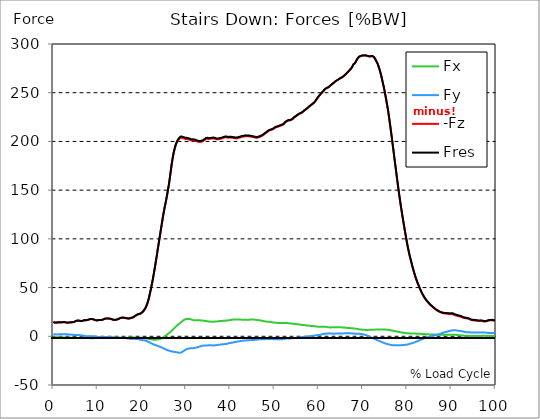
| Category |  Fx |  Fy |  -Fz |  Fres |
|---|---|---|---|---|
| 0.0 | -0.856 | 2.139 | 14.563 | 14.754 |
| 0.167348456675344 | -0.887 | 2.158 | 14.25 | 14.45 |
| 0.334696913350688 | -0.89 | 2.078 | 13.935 | 14.126 |
| 0.5020453700260321 | -0.883 | 1.944 | 13.782 | 13.958 |
| 0.669393826701376 | -0.934 | 1.92 | 13.981 | 14.156 |
| 0.83674228337672 | -0.978 | 1.918 | 14.109 | 14.286 |
| 1.0040907400520642 | -1.011 | 1.95 | 14.139 | 14.321 |
| 1.1621420602454444 | -1.048 | 1.988 | 14.155 | 14.344 |
| 1.3294905169207885 | -1.08 | 2.017 | 14.145 | 14.338 |
| 1.4968389735961325 | -1.109 | 2.034 | 14.122 | 14.32 |
| 1.6641874302714765 | -1.133 | 2.03 | 14.132 | 14.327 |
| 1.8315358869468206 | -1.163 | 2.047 | 14.205 | 14.402 |
| 1.9988843436221646 | -1.197 | 2.075 | 14.298 | 14.501 |
| 2.1662328002975086 | -1.246 | 2.134 | 14.36 | 14.575 |
| 2.333581256972853 | -1.307 | 2.191 | 14.387 | 14.616 |
| 2.5009297136481967 | -1.357 | 2.228 | 14.334 | 14.575 |
| 2.6682781703235405 | -1.373 | 2.208 | 14.266 | 14.507 |
| 2.8356266269988843 | -1.379 | 2.179 | 14.081 | 14.322 |
| 3.002975083674229 | -1.381 | 2.147 | 13.872 | 14.113 |
| 3.1703235403495724 | -1.372 | 2.031 | 13.808 | 14.033 |
| 3.337671997024917 | -1.369 | 1.926 | 13.778 | 13.99 |
| 3.4957233172182973 | -1.386 | 1.842 | 13.952 | 14.154 |
| 3.663071773893641 | -1.407 | 1.803 | 14.104 | 14.302 |
| 3.8304202305689854 | -1.422 | 1.763 | 14.195 | 14.389 |
| 3.997768687244329 | -1.436 | 1.713 | 14.263 | 14.449 |
| 4.165117143919673 | -1.45 | 1.664 | 14.335 | 14.513 |
| 4.332465600595017 | -1.462 | 1.601 | 14.401 | 14.57 |
| 4.499814057270361 | -1.467 | 1.502 | 14.439 | 14.595 |
| 4.667162513945706 | -1.47 | 1.398 | 14.538 | 14.682 |
| 4.834510970621049 | -1.493 | 1.328 | 15.018 | 15.155 |
| 5.001859427296393 | -1.551 | 1.334 | 15.474 | 15.612 |
| 5.169207883971737 | -1.612 | 1.361 | 15.71 | 15.856 |
| 5.336556340647081 | -1.659 | 1.344 | 15.936 | 16.082 |
| 5.503904797322425 | -1.707 | 1.318 | 16.056 | 16.205 |
| 5.671253253997769 | -1.746 | 1.278 | 16.058 | 16.207 |
| 5.82930457419115 | -1.773 | 1.224 | 15.947 | 16.096 |
| 5.996653030866494 | -1.79 | 1.154 | 15.799 | 15.946 |
| 6.164001487541838 | -1.785 | 1.029 | 15.674 | 15.814 |
| 6.331349944217181 | -1.767 | 0.879 | 15.52 | 15.65 |
| 6.498698400892526 | -1.763 | 0.75 | 15.679 | 15.801 |
| 6.66604685756787 | -1.762 | 0.626 | 15.905 | 16.021 |
| 6.833395314243213 | -1.779 | 0.536 | 16.179 | 16.292 |
| 7.000743770918558 | -1.831 | 0.504 | 16.479 | 16.594 |
| 7.168092227593902 | -1.816 | 0.355 | 16.421 | 16.531 |
| 7.335440684269246 | -1.771 | 0.145 | 16.364 | 16.465 |
| 7.50278914094459 | -1.733 | -0.04 | 16.389 | 16.483 |
| 7.6701375976199335 | -1.726 | -0.129 | 16.654 | 16.747 |
| 7.837486054295278 | -1.774 | -0.1 | 16.971 | 17.067 |
| 7.995537374488658 | -1.821 | -0.076 | 17.109 | 17.209 |
| 8.162885831164003 | -1.878 | -0.048 | 17.316 | 17.421 |
| 8.330234287839346 | -1.936 | -0.023 | 17.607 | 17.716 |
| 8.49758274451469 | -1.982 | -0.014 | 17.65 | 17.763 |
| 8.664931201190035 | -2.027 | 0.01 | 17.646 | 17.764 |
| 8.832279657865378 | -2.037 | -0.003 | 17.536 | 17.656 |
| 8.999628114540721 | -2.023 | -0.032 | 17.356 | 17.477 |
| 9.166976571216066 | -1.99 | -0.073 | 17.115 | 17.234 |
| 9.334325027891412 | -1.906 | -0.164 | 16.813 | 16.926 |
| 9.501673484566755 | -1.789 | -0.298 | 16.509 | 16.614 |
| 9.669021941242098 | -1.671 | -0.451 | 16.307 | 16.406 |
| 9.836370397917442 | -1.551 | -0.586 | 16.242 | 16.335 |
| 10.003718854592787 | -1.452 | -0.69 | 16.324 | 16.411 |
| 10.17106731126813 | -1.381 | -0.77 | 16.445 | 16.528 |
| 10.329118631461512 | -1.363 | -0.788 | 16.699 | 16.779 |
| 10.496467088136853 | -1.409 | -0.711 | 16.793 | 16.875 |
| 10.663815544812199 | -1.403 | -0.745 | 16.701 | 16.784 |
| 10.831164001487544 | -1.362 | -0.861 | 16.615 | 16.701 |
| 10.998512458162887 | -1.343 | -0.929 | 16.738 | 16.827 |
| 11.16586091483823 | -1.35 | -0.95 | 17.023 | 17.112 |
| 11.333209371513574 | -1.393 | -0.921 | 17.376 | 17.464 |
| 11.50055782818892 | -1.439 | -0.891 | 17.702 | 17.79 |
| 11.667906284864264 | -1.516 | -0.824 | 17.996 | 18.086 |
| 11.835254741539607 | -1.592 | -0.763 | 18.184 | 18.276 |
| 12.00260319821495 | -1.657 | -0.718 | 18.248 | 18.343 |
| 12.169951654890292 | -1.718 | -0.681 | 18.296 | 18.395 |
| 12.337300111565641 | -1.756 | -0.67 | 18.253 | 18.355 |
| 12.504648568240984 | -1.778 | -0.676 | 18.165 | 18.271 |
| 12.662699888434362 | -1.796 | -0.677 | 18.087 | 18.194 |
| 12.830048345109708 | -1.812 | -0.679 | 18.006 | 18.114 |
| 12.997396801785053 | -1.779 | -0.733 | 17.819 | 17.927 |
| 13.164745258460396 | -1.731 | -0.815 | 17.521 | 17.631 |
| 13.33209371513574 | -1.664 | -0.936 | 17.182 | 17.295 |
| 13.499442171811083 | -1.575 | -1.082 | 16.939 | 17.056 |
| 13.666790628486426 | -1.48 | -1.21 | 16.779 | 16.899 |
| 13.834139085161771 | -1.405 | -1.323 | 16.706 | 16.828 |
| 14.001487541837117 | -1.364 | -1.421 | 16.775 | 16.9 |
| 14.16883599851246 | -1.34 | -1.507 | 16.89 | 17.019 |
| 14.336184455187803 | -1.347 | -1.56 | 17.072 | 17.204 |
| 14.503532911863147 | -1.377 | -1.592 | 17.316 | 17.45 |
| 14.670881368538492 | -1.428 | -1.594 | 17.622 | 17.758 |
| 14.828932688731873 | -1.493 | -1.571 | 17.994 | 18.13 |
| 14.996281145407215 | -1.588 | -1.537 | 18.358 | 18.495 |
| 15.163629602082558 | -1.693 | -1.508 | 18.718 | 18.858 |
| 15.330978058757903 | -1.77 | -1.493 | 18.964 | 19.108 |
| 15.498326515433247 | -1.836 | -1.498 | 19.048 | 19.197 |
| 15.665674972108594 | -1.855 | -1.515 | 19.025 | 19.179 |
| 15.833023428783937 | -1.854 | -1.548 | 19.024 | 19.18 |
| 16.00037188545928 | -1.844 | -1.595 | 18.956 | 19.115 |
| 16.167720342134626 | -1.805 | -1.679 | 18.82 | 18.984 |
| 16.335068798809967 | -1.746 | -1.786 | 18.662 | 18.834 |
| 16.502417255485312 | -1.66 | -1.921 | 18.483 | 18.663 |
| 16.669765712160658 | -1.557 | -2.07 | 18.311 | 18.501 |
| 16.837114168836 | -1.443 | -2.22 | 18.169 | 18.37 |
| 17.004462625511344 | -1.323 | -2.365 | 18.104 | 18.317 |
| 17.16251394570472 | -1.224 | -2.495 | 18.181 | 18.404 |
| 17.32986240238007 | -1.149 | -2.6 | 18.353 | 18.583 |
| 17.497210859055414 | -1.111 | -2.662 | 18.597 | 18.832 |
| 17.664559315730756 | -1.079 | -2.719 | 18.814 | 19.05 |
| 17.8319077724061 | -1.133 | -2.689 | 19.011 | 19.247 |
| 17.999256229081443 | -1.18 | -2.67 | 19.31 | 19.542 |
| 18.166604685756788 | -1.242 | -2.645 | 19.761 | 19.989 |
| 18.333953142432133 | -1.334 | -2.627 | 20.32 | 20.544 |
| 18.501301599107478 | -1.439 | -2.632 | 20.833 | 21.059 |
| 18.668650055782823 | -1.544 | -2.671 | 21.257 | 21.491 |
| 18.835998512458165 | -1.636 | -2.745 | 21.714 | 21.958 |
| 19.00334696913351 | -1.721 | -2.859 | 22.211 | 22.469 |
| 19.170695425808855 | -1.747 | -2.975 | 22.441 | 22.712 |
| 19.338043882484197 | -1.714 | -3.152 | 22.61 | 22.899 |
| 19.496095202677576 | -1.657 | -3.359 | 22.805 | 23.116 |
| 19.66344365935292 | -1.586 | -3.558 | 23.028 | 23.362 |
| 19.830792116028263 | -1.545 | -3.734 | 23.37 | 23.725 |
| 19.998140572703612 | -1.617 | -3.86 | 24.08 | 24.449 |
| 20.165489029378953 | -1.664 | -3.957 | 24.751 | 25.128 |
| 20.3328374860543 | -1.75 | -4.006 | 25.448 | 25.827 |
| 20.500185942729644 | -1.856 | -4.114 | 26.407 | 26.796 |
| 20.667534399404985 | -1.987 | -4.297 | 27.7 | 28.107 |
| 20.83488285608033 | -2.124 | -4.437 | 28.876 | 29.297 |
| 21.002231312755672 | -2.273 | -4.689 | 30.488 | 30.936 |
| 21.16957976943102 | -2.427 | -5.004 | 32.407 | 32.888 |
| 21.336928226106362 | -2.592 | -5.348 | 34.663 | 35.175 |
| 21.504276682781704 | -2.758 | -5.705 | 37.169 | 37.711 |
| 21.67162513945705 | -2.905 | -6.083 | 40.21 | 40.778 |
| 21.82967645965043 | -3.047 | -6.468 | 43.575 | 44.164 |
| 21.997024916325774 | -3.174 | -6.849 | 47.05 | 47.658 |
| 22.16437337300112 | -3.279 | -7.244 | 50.66 | 51.286 |
| 22.33172182967646 | -3.361 | -7.64 | 54.411 | 55.055 |
| 22.499070286351806 | -3.428 | -7.991 | 58.438 | 59.09 |
| 22.666418743027148 | -3.484 | -8.305 | 62.654 | 63.307 |
| 22.833767199702496 | -3.522 | -8.602 | 67.057 | 67.707 |
| 23.00111565637784 | -3.505 | -8.892 | 71.548 | 72.192 |
| 23.168464113053183 | -3.424 | -9.173 | 76.198 | 76.835 |
| 23.335812569728528 | -3.379 | -9.451 | 80.88 | 81.51 |
| 23.50316102640387 | -3.314 | -9.754 | 85.886 | 86.512 |
| 23.670509483079215 | -3.21 | -10.031 | 90.663 | 91.282 |
| 23.83785793975456 | -3.077 | -10.291 | 95.404 | 96.017 |
| 23.995909259947936 | -2.908 | -10.551 | 100.14 | 100.744 |
| 24.163257716623285 | -2.673 | -10.854 | 104.946 | 105.549 |
| 24.330606173298627 | -2.416 | -11.176 | 109.795 | 110.398 |
| 24.49795462997397 | -2.083 | -11.527 | 114.503 | 115.109 |
| 24.665303086649313 | -1.681 | -11.904 | 119.182 | 119.796 |
| 24.83265154332466 | -1.255 | -12.285 | 123.802 | 124.424 |
| 25.0 | -0.751 | -12.625 | 127.965 | 128.598 |
| 25.167348456675345 | -0.207 | -12.983 | 132.083 | 132.731 |
| 25.334696913350694 | 0.381 | -13.331 | 135.666 | 136.33 |
| 25.502045370026035 | 0.99 | -13.67 | 139.379 | 140.058 |
| 25.669393826701377 | 1.621 | -13.983 | 143.398 | 144.093 |
| 25.836742283376722 | 2.25 | -14.277 | 147.712 | 148.424 |
| 26.004090740052067 | 2.853 | -14.524 | 152.145 | 152.87 |
| 26.17143919672741 | 3.444 | -14.744 | 156.581 | 157.318 |
| 26.329490516920792 | 3.987 | -15.001 | 161.968 | 162.718 |
| 26.49683897359613 | 4.579 | -15.243 | 167.689 | 168.448 |
| 26.66418743027148 | 5.221 | -15.383 | 173.395 | 174.162 |
| 26.831535886946828 | 5.939 | -15.538 | 178.668 | 179.45 |
| 26.998884343622166 | 6.743 | -15.746 | 182.991 | 183.798 |
| 27.166232800297514 | 7.512 | -15.892 | 187.215 | 188.047 |
| 27.333581256972852 | 8.291 | -16.006 | 190.386 | 191.247 |
| 27.5009297136482 | 9.054 | -16.118 | 193.368 | 194.259 |
| 27.668278170323543 | 9.795 | -16.237 | 195.916 | 196.839 |
| 27.835626626998888 | 10.506 | -16.378 | 197.877 | 198.84 |
| 28.002975083674233 | 11.219 | -16.505 | 199.533 | 200.537 |
| 28.170323540349575 | 11.922 | -16.644 | 200.79 | 201.839 |
| 28.33767199702492 | 12.488 | -16.79 | 201.789 | 202.879 |
| 28.50502045370026 | 13.004 | -16.908 | 202.865 | 203.991 |
| 28.663071773893645 | 13.577 | -16.928 | 203.644 | 204.804 |
| 28.830420230568986 | 14.216 | -16.75 | 203.923 | 205.11 |
| 28.99776868724433 | 14.848 | -16.393 | 203.981 | 205.186 |
| 29.165117143919673 | 15.527 | -15.91 | 203.656 | 204.875 |
| 29.33246560059502 | 16.126 | -15.429 | 203.368 | 204.599 |
| 29.499814057270367 | 16.677 | -14.913 | 203.107 | 204.346 |
| 29.66716251394571 | 17.116 | -14.407 | 202.86 | 204.1 |
| 29.834510970621054 | 17.474 | -13.964 | 202.493 | 203.736 |
| 30.00185942729639 | 17.686 | -13.559 | 202.481 | 203.716 |
| 30.169207883971744 | 17.824 | -13.165 | 202.46 | 203.682 |
| 30.33655634064708 | 17.879 | -12.893 | 202.447 | 203.656 |
| 30.50390479732243 | 17.868 | -12.679 | 202.149 | 203.346 |
| 30.671253253997772 | 17.786 | -12.481 | 202.007 | 203.185 |
| 30.829304574191156 | 17.686 | -12.315 | 201.664 | 202.826 |
| 30.996653030866494 | 17.53 | -12.262 | 201.292 | 202.437 |
| 31.164001487541842 | 17.307 | -12.262 | 201.091 | 202.218 |
| 31.331349944217187 | 17.018 | -12.226 | 201.05 | 202.15 |
| 31.498698400892525 | 16.712 | -12.215 | 201.112 | 202.186 |
| 31.666046857567874 | 16.503 | -12.147 | 201.141 | 202.193 |
| 31.833395314243212 | 16.41 | -12.021 | 200.972 | 202.011 |
| 32.00074377091856 | 16.364 | -11.862 | 200.979 | 202.007 |
| 32.1680922275939 | 16.334 | -11.71 | 200.688 | 201.707 |
| 32.33544068426925 | 16.418 | -11.552 | 200.29 | 201.307 |
| 32.50278914094459 | 16.458 | -11.376 | 199.936 | 200.949 |
| 32.670137597619934 | 16.465 | -11.178 | 199.666 | 200.67 |
| 32.83748605429528 | 16.436 | -10.945 | 199.563 | 200.553 |
| 33.004834510970625 | 16.406 | -10.713 | 199.459 | 200.436 |
| 33.162885831164004 | 16.352 | -10.444 | 199.464 | 200.427 |
| 33.33023428783935 | 16.297 | -10.164 | 199.591 | 200.536 |
| 33.497582744514695 | 16.238 | -9.91 | 199.767 | 200.699 |
| 33.664931201190036 | 16.178 | -9.68 | 199.987 | 200.906 |
| 33.83227965786538 | 16.096 | -9.591 | 200.417 | 201.325 |
| 33.99962811454073 | 15.975 | -9.563 | 200.864 | 201.761 |
| 34.16697657121607 | 15.873 | -9.534 | 201.479 | 202.365 |
| 34.33432502789141 | 15.772 | -9.505 | 202.096 | 202.971 |
| 34.50167348456676 | 15.663 | -9.494 | 202.675 | 203.538 |
| 34.6690219412421 | 15.497 | -9.444 | 202.986 | 203.834 |
| 34.83637039791744 | 15.354 | -9.424 | 202.877 | 203.713 |
| 35.00371885459279 | 15.293 | -9.32 | 202.584 | 203.413 |
| 35.17106731126814 | 15.231 | -9.256 | 202.514 | 203.335 |
| 35.338415767943474 | 15.175 | -9.22 | 202.54 | 203.355 |
| 35.49646708813686 | 15.107 | -9.243 | 202.75 | 203.56 |
| 35.6638155448122 | 15.04 | -9.283 | 202.883 | 203.689 |
| 35.831164001487544 | 14.98 | -9.318 | 202.964 | 203.766 |
| 35.998512458162885 | 14.95 | -9.337 | 203.093 | 203.893 |
| 36.165860914838234 | 14.977 | -9.355 | 203.178 | 203.98 |
| 36.333209371513576 | 15.013 | -9.36 | 203.144 | 203.95 |
| 36.50055782818892 | 15.072 | -9.346 | 202.896 | 203.707 |
| 36.667906284864266 | 15.138 | -9.29 | 202.536 | 203.35 |
| 36.83525474153961 | 15.204 | -9.121 | 202.282 | 203.093 |
| 37.002603198214956 | 15.279 | -8.961 | 202.172 | 202.978 |
| 37.1699516548903 | 15.372 | -8.863 | 202.197 | 203.003 |
| 37.337300111565646 | 15.452 | -8.74 | 202.403 | 203.206 |
| 37.50464856824098 | 15.521 | -8.654 | 202.495 | 203.297 |
| 37.66269988843437 | 15.586 | -8.559 | 202.642 | 203.442 |
| 37.83004834510971 | 15.651 | -8.459 | 202.812 | 203.61 |
| 37.99739680178505 | 15.719 | -8.358 | 203.004 | 203.8 |
| 38.16474525846039 | 15.787 | -8.256 | 203.21 | 204.005 |
| 38.33209371513574 | 15.844 | -8.162 | 203.477 | 204.269 |
| 38.49944217181109 | 15.887 | -8.085 | 203.827 | 204.618 |
| 38.666790628486424 | 15.964 | -8.048 | 204.059 | 204.853 |
| 38.83413908516178 | 16.055 | -8.018 | 204.242 | 205.042 |
| 39.001487541837115 | 16.13 | -7.956 | 204.433 | 205.236 |
| 39.16883599851246 | 16.221 | -7.834 | 204.289 | 205.095 |
| 39.336184455187805 | 16.293 | -7.678 | 203.914 | 204.721 |
| 39.503532911863154 | 16.379 | -7.385 | 203.754 | 204.56 |
| 39.670881368538495 | 16.428 | -7.075 | 203.972 | 204.772 |
| 39.83822982521384 | 16.501 | -6.893 | 204.011 | 204.813 |
| 39.996281145407224 | 16.627 | -6.814 | 203.959 | 204.77 |
| 40.163629602082565 | 16.793 | -6.75 | 203.908 | 204.733 |
| 40.33097805875791 | 16.978 | -6.67 | 203.868 | 204.707 |
| 40.498326515433256 | 17.079 | -6.464 | 203.783 | 204.625 |
| 40.6656749721086 | 17.154 | -6.309 | 203.693 | 204.537 |
| 40.83302342878393 | 17.22 | -6.169 | 203.457 | 204.304 |
| 41.00037188545929 | 17.233 | -6.002 | 203.306 | 204.149 |
| 41.16772034213463 | 17.258 | -5.827 | 203.219 | 204.06 |
| 41.33506879880997 | 17.285 | -5.65 | 203.14 | 203.979 |
| 41.50241725548531 | 17.298 | -5.495 | 203.103 | 203.94 |
| 41.66976571216066 | 17.301 | -5.375 | 203.271 | 204.105 |
| 41.837114168836 | 17.32 | -5.325 | 203.697 | 204.528 |
| 42.004462625511344 | 17.294 | -5.186 | 203.907 | 204.731 |
| 42.17181108218669 | 17.218 | -5.036 | 203.983 | 204.795 |
| 42.32986240238007 | 17.17 | -4.923 | 204.318 | 205.12 |
| 42.497210859055414 | 17.114 | -4.805 | 204.608 | 205.4 |
| 42.66455931573076 | 17.013 | -4.651 | 204.68 | 205.46 |
| 42.831907772406105 | 16.937 | -4.521 | 204.807 | 205.577 |
| 42.999256229081446 | 16.904 | -4.431 | 205.005 | 205.769 |
| 43.16660468575679 | 16.874 | -4.368 | 205.18 | 205.94 |
| 43.33395314243214 | 16.843 | -4.31 | 205.366 | 206.122 |
| 43.50130159910748 | 16.857 | -4.283 | 205.473 | 206.23 |
| 43.66865005578282 | 16.89 | -4.205 | 205.395 | 206.154 |
| 43.83599851245817 | 16.913 | -4.171 | 205.302 | 206.063 |
| 44.00334696913351 | 16.947 | -4.131 | 205.34 | 206.104 |
| 44.17069542580886 | 16.964 | -4.042 | 205.401 | 206.164 |
| 44.3380438824842 | 17.012 | -3.957 | 205.354 | 206.121 |
| 44.49609520267758 | 17.118 | -3.935 | 205.083 | 205.86 |
| 44.66344365935292 | 17.173 | -3.892 | 204.785 | 205.566 |
| 44.83079211602827 | 17.174 | -3.803 | 204.824 | 205.607 |
| 44.99814057270361 | 17.201 | -3.81 | 204.721 | 205.508 |
| 45.16548902937895 | 17.21 | -3.815 | 204.472 | 205.262 |
| 45.332837486054295 | 17.171 | -3.808 | 204.287 | 205.075 |
| 45.500185942729644 | 17.082 | -3.711 | 204.133 | 204.911 |
| 45.66753439940499 | 16.992 | -3.625 | 203.968 | 204.738 |
| 45.83488285608033 | 16.9 | -3.55 | 203.8 | 204.562 |
| 46.00223131275568 | 16.791 | -3.436 | 203.784 | 204.536 |
| 46.16957976943102 | 16.68 | -3.309 | 203.868 | 204.608 |
| 46.336928226106366 | 16.575 | -3.177 | 204.146 | 204.877 |
| 46.50427668278171 | 16.469 | -3.121 | 204.411 | 205.134 |
| 46.671625139457056 | 16.366 | -3.096 | 204.664 | 205.38 |
| 46.829676459650436 | 16.242 | -3.071 | 204.907 | 205.613 |
| 46.99702491632577 | 16.112 | -3.048 | 205.28 | 205.975 |
| 47.16437337300112 | 15.969 | -3.02 | 205.751 | 206.434 |
| 47.33172182967646 | 15.813 | -2.989 | 206.228 | 206.897 |
| 47.49907028635181 | 15.636 | -2.989 | 206.741 | 207.397 |
| 47.66641874302716 | 15.452 | -2.967 | 207.388 | 208.03 |
| 47.83376719970249 | 15.305 | -2.931 | 207.95 | 208.58 |
| 48.001115656377834 | 15.2 | -2.895 | 208.495 | 209.116 |
| 48.16846411305319 | 15.115 | -2.879 | 209.044 | 209.656 |
| 48.33581256972853 | 15.027 | -2.86 | 209.624 | 210.227 |
| 48.50316102640387 | 14.963 | -2.845 | 210.243 | 210.837 |
| 48.67050948307921 | 14.909 | -2.821 | 210.793 | 211.38 |
| 48.837857939754564 | 14.862 | -2.786 | 211.294 | 211.874 |
| 49.005206396429905 | 14.762 | -2.766 | 211.673 | 212.243 |
| 49.163257716623285 | 14.642 | -2.798 | 211.743 | 212.306 |
| 49.33060617329863 | 14.486 | -2.852 | 211.929 | 212.482 |
| 49.49795462997397 | 14.336 | -2.907 | 212.187 | 212.731 |
| 49.66530308664932 | 14.193 | -2.961 | 212.543 | 213.079 |
| 49.832651543324666 | 14.096 | -2.975 | 213.053 | 213.582 |
| 50.0 | 14.019 | -2.963 | 213.666 | 214.189 |
| 50.16734845667534 | 13.943 | -2.95 | 214.271 | 214.787 |
| 50.33469691335069 | 13.879 | -2.981 | 214.529 | 215.042 |
| 50.50204537002604 | 13.816 | -3.014 | 214.788 | 215.298 |
| 50.66939382670139 | 13.77 | -3.026 | 215.016 | 215.523 |
| 50.836742283376715 | 13.732 | -3.02 | 215.257 | 215.763 |
| 51.00409074005207 | 13.689 | -3.011 | 215.534 | 216.035 |
| 51.17143919672741 | 13.675 | -3 | 215.809 | 216.309 |
| 51.32949051692079 | 13.684 | -3.004 | 216.115 | 216.615 |
| 51.496838973596134 | 13.706 | -3.018 | 216.431 | 216.931 |
| 51.66418743027148 | 13.754 | -3.033 | 216.648 | 217.151 |
| 51.831535886946824 | 13.779 | -2.984 | 217.017 | 217.52 |
| 51.99888434362217 | 13.75 | -2.805 | 217.579 | 218.079 |
| 52.16623280029752 | 13.69 | -2.648 | 218.125 | 218.619 |
| 52.33358125697285 | 13.626 | -2.46 | 219.054 | 219.542 |
| 52.5009297136482 | 13.577 | -2.325 | 219.85 | 220.335 |
| 52.668278170323546 | 13.571 | -2.317 | 220.276 | 220.76 |
| 52.835626626998895 | 13.57 | -2.317 | 220.708 | 221.193 |
| 53.00297508367424 | 13.521 | -2.314 | 221.147 | 221.628 |
| 53.17032354034958 | 13.465 | -2.314 | 221.501 | 221.979 |
| 53.33767199702492 | 13.379 | -2.311 | 221.468 | 221.941 |
| 53.50502045370027 | 13.286 | -2.252 | 221.543 | 222.009 |
| 53.663071773893655 | 13.169 | -2.16 | 221.812 | 222.27 |
| 53.83042023056899 | 13.028 | -2.105 | 222.157 | 222.607 |
| 53.99776868724433 | 12.926 | -2.024 | 222.679 | 223.122 |
| 54.16511714391967 | 12.829 | -1.932 | 223.185 | 223.623 |
| 54.33246560059503 | 12.769 | -1.934 | 224.132 | 224.568 |
| 54.49981405727037 | 12.71 | -1.901 | 224.747 | 225.179 |
| 54.667162513945705 | 12.626 | -1.827 | 225.184 | 225.608 |
| 54.834510970621054 | 12.481 | -1.694 | 225.721 | 226.134 |
| 55.0018594272964 | 12.349 | -1.609 | 226.415 | 226.819 |
| 55.169207883971744 | 12.322 | -1.503 | 226.878 | 227.279 |
| 55.336556340647086 | 12.282 | -1.413 | 227.421 | 227.819 |
| 55.50390479732243 | 12.18 | -1.297 | 227.936 | 228.325 |
| 55.671253253997776 | 12.081 | -1.199 | 228.353 | 228.734 |
| 55.83860171067312 | 11.968 | -1.128 | 228.727 | 229.099 |
| 55.9966530308665 | 11.817 | -1.028 | 229.106 | 229.473 |
| 56.16400148754184 | 11.718 | -0.903 | 229.481 | 229.844 |
| 56.33134994421718 | 11.679 | -0.783 | 229.932 | 230.292 |
| 56.498698400892536 | 11.615 | -0.717 | 230.545 | 230.9 |
| 56.66604685756788 | 11.542 | -0.672 | 231.226 | 231.576 |
| 56.83339531424321 | 11.436 | -0.598 | 231.97 | 232.314 |
| 57.00074377091856 | 11.295 | -0.496 | 232.506 | 232.844 |
| 57.16809222759391 | 11.169 | -0.388 | 233.014 | 233.347 |
| 57.33544068426925 | 11.081 | -0.266 | 233.617 | 233.947 |
| 57.5027891409446 | 11.014 | -0.137 | 234.31 | 234.638 |
| 57.670137597619934 | 10.947 | -0.036 | 235.01 | 235.336 |
| 57.83748605429528 | 10.902 | 0.032 | 235.621 | 235.946 |
| 58.004834510970625 | 10.825 | 0.084 | 236.296 | 236.616 |
| 58.16288583116401 | 10.689 | 0.17 | 236.923 | 237.236 |
| 58.330234287839346 | 10.559 | 0.263 | 237.497 | 237.806 |
| 58.497582744514695 | 10.471 | 0.382 | 237.985 | 238.29 |
| 58.66493120119004 | 10.442 | 0.529 | 238.518 | 238.821 |
| 58.832279657865385 | 10.401 | 0.693 | 239.264 | 239.567 |
| 58.999628114540734 | 10.329 | 0.776 | 239.946 | 240.248 |
| 59.16697657121607 | 10.232 | 0.854 | 240.753 | 241.05 |
| 59.33432502789142 | 10.136 | 0.964 | 241.902 | 242.195 |
| 59.50167348456676 | 10.037 | 1.062 | 243.035 | 243.323 |
| 59.66902194124211 | 9.945 | 1.138 | 244.1 | 244.385 |
| 59.83637039791745 | 9.861 | 1.226 | 245.188 | 245.471 |
| 60.00371885459278 | 9.776 | 1.313 | 246.277 | 246.558 |
| 60.17106731126813 | 9.742 | 1.434 | 247.294 | 247.575 |
| 60.33841576794349 | 9.702 | 1.557 | 248.036 | 248.315 |
| 60.49646708813685 | 9.728 | 1.721 | 248.909 | 249.188 |
| 60.6638155448122 | 9.764 | 1.906 | 249.737 | 250.018 |
| 60.831164001487544 | 9.794 | 2.093 | 250.562 | 250.844 |
| 60.99851245816289 | 9.816 | 2.27 | 251.4 | 251.684 |
| 61.16586091483824 | 9.817 | 2.425 | 252.268 | 252.553 |
| 61.333209371513576 | 9.797 | 2.552 | 253.115 | 253.399 |
| 61.50055782818892 | 9.743 | 2.641 | 253.821 | 254.101 |
| 61.667906284864266 | 9.686 | 2.724 | 254.436 | 254.713 |
| 61.835254741539615 | 9.561 | 2.794 | 254.814 | 255.082 |
| 62.002603198214956 | 9.365 | 2.912 | 255.033 | 255.287 |
| 62.16995165489029 | 9.204 | 3.001 | 255.38 | 255.621 |
| 62.33730011156564 | 9.139 | 3.003 | 256.036 | 256.274 |
| 62.504648568240995 | 9.085 | 2.972 | 256.821 | 257.053 |
| 62.67199702491633 | 9.101 | 2.96 | 257.393 | 257.626 |
| 62.83004834510971 | 9.146 | 2.906 | 257.973 | 258.206 |
| 62.99739680178505 | 9.171 | 2.791 | 258.632 | 258.863 |
| 63.1647452584604 | 9.207 | 2.71 | 259.202 | 259.433 |
| 63.33209371513575 | 9.18 | 2.678 | 259.865 | 260.093 |
| 63.4994421718111 | 9.162 | 2.697 | 260.383 | 260.607 |
| 63.666790628486424 | 9.155 | 2.708 | 261.105 | 261.326 |
| 63.83413908516177 | 9.208 | 2.772 | 261.692 | 261.914 |
| 64.00148754183712 | 9.298 | 2.823 | 262.268 | 262.494 |
| 64.16883599851248 | 9.347 | 2.865 | 262.686 | 262.912 |
| 64.3361844551878 | 9.352 | 2.866 | 263.11 | 263.336 |
| 64.50353291186315 | 9.273 | 2.764 | 263.668 | 263.891 |
| 64.6708813685385 | 9.244 | 2.758 | 264.159 | 264.38 |
| 64.83822982521384 | 9.217 | 2.762 | 264.645 | 264.865 |
| 65.00557828188919 | 9.155 | 2.739 | 265.137 | 265.355 |
| 65.16362960208257 | 9.145 | 2.846 | 265.397 | 265.612 |
| 65.3309780587579 | 9.132 | 2.95 | 265.801 | 266.014 |
| 65.49832651543326 | 9.068 | 2.951 | 266.391 | 266.6 |
| 65.6656749721086 | 9.03 | 2.987 | 267.052 | 267.26 |
| 65.83302342878395 | 8.949 | 3.029 | 267.686 | 267.889 |
| 66.00037188545929 | 8.832 | 3.102 | 268.583 | 268.779 |
| 66.16772034213463 | 8.727 | 3.122 | 269.367 | 269.557 |
| 66.33506879880998 | 8.637 | 3.078 | 270.007 | 270.193 |
| 66.50241725548531 | 8.549 | 3.034 | 270.712 | 270.893 |
| 66.66976571216065 | 8.479 | 3.017 | 271.537 | 271.715 |
| 66.83711416883601 | 8.441 | 3.036 | 272.334 | 272.508 |
| 67.00446262551135 | 8.395 | 3.06 | 273.152 | 273.324 |
| 67.1718110821867 | 8.342 | 3.073 | 274.092 | 274.262 |
| 67.32986240238007 | 8.275 | 2.986 | 274.788 | 274.955 |
| 67.49721085905541 | 8.209 | 2.958 | 275.922 | 276.087 |
| 67.66455931573076 | 8.147 | 2.96 | 277.265 | 277.427 |
| 67.83190777240611 | 8.062 | 2.99 | 278.952 | 279.11 |
| 67.99925622908145 | 7.987 | 2.873 | 279.922 | 280.078 |
| 68.16660468575678 | 7.921 | 2.607 | 280.16 | 280.314 |
| 68.33395314243214 | 7.819 | 2.531 | 281.359 | 281.509 |
| 68.50130159910749 | 7.702 | 2.527 | 282.918 | 283.064 |
| 68.66865005578282 | 7.595 | 2.527 | 284.278 | 284.422 |
| 68.83599851245816 | 7.45 | 2.523 | 285.354 | 285.497 |
| 69.00334696913352 | 7.281 | 2.52 | 286.221 | 286.362 |
| 69.17069542580886 | 7.139 | 2.549 | 287.009 | 287.148 |
| 69.3380438824842 | 7.06 | 2.487 | 287.436 | 287.574 |
| 69.50539233915956 | 6.992 | 2.387 | 287.65 | 287.785 |
| 69.66344365935292 | 6.902 | 2.304 | 287.883 | 288.018 |
| 69.83079211602826 | 6.812 | 2.22 | 288.118 | 288.25 |
| 69.99814057270362 | 6.779 | 2.053 | 288.111 | 288.244 |
| 70.16548902937896 | 6.709 | 1.893 | 288.189 | 288.32 |
| 70.33283748605429 | 6.636 | 1.718 | 288.236 | 288.366 |
| 70.50018594272964 | 6.562 | 1.512 | 288.216 | 288.343 |
| 70.667534399405 | 6.491 | 1.245 | 288.146 | 288.272 |
| 70.83488285608033 | 6.442 | 0.925 | 287.975 | 288.098 |
| 71.00223131275568 | 6.423 | 0.589 | 287.714 | 287.837 |
| 71.16957976943102 | 6.529 | 0.225 | 287.544 | 287.668 |
| 71.33692822610637 | 6.583 | -0.155 | 287.298 | 287.423 |
| 71.50427668278171 | 6.611 | -0.545 | 287.203 | 287.329 |
| 71.67162513945706 | 6.659 | -0.923 | 287.273 | 287.399 |
| 71.8389735961324 | 6.652 | -1.223 | 287.451 | 287.577 |
| 71.99702491632577 | 6.674 | -1.492 | 287.468 | 287.593 |
| 72.16437337300113 | 6.699 | -1.759 | 287.464 | 287.588 |
| 72.33172182967647 | 6.747 | -2.055 | 287.304 | 287.429 |
| 72.49907028635181 | 6.79 | -2.393 | 286.467 | 286.594 |
| 72.66641874302715 | 6.813 | -2.734 | 285.362 | 285.491 |
| 72.8337671997025 | 6.85 | -3.088 | 283.977 | 284.108 |
| 73.00111565637783 | 6.891 | -3.454 | 282.545 | 282.681 |
| 73.16846411305319 | 6.945 | -3.818 | 281.043 | 281.184 |
| 73.33581256972853 | 7.013 | -4.154 | 279.493 | 279.64 |
| 73.50316102640387 | 7.04 | -4.473 | 277.245 | 277.398 |
| 73.67050948307921 | 7.027 | -4.767 | 274.96 | 275.118 |
| 73.83785793975457 | 7.02 | -5.07 | 272.472 | 272.636 |
| 74.00520639642991 | 7.004 | -5.374 | 269.679 | 269.849 |
| 74.16325771662328 | 7.02 | -5.699 | 266.759 | 266.936 |
| 74.33060617329863 | 7.018 | -6.029 | 263.382 | 263.568 |
| 74.49795462997398 | 7.007 | -6.362 | 259.907 | 260.101 |
| 74.66530308664932 | 7.012 | -6.69 | 256.658 | 256.863 |
| 74.83265154332466 | 6.973 | -6.981 | 252.914 | 253.127 |
| 75.00000000000001 | 6.924 | -7.253 | 249.035 | 249.257 |
| 75.16734845667534 | 6.876 | -7.499 | 244.944 | 245.175 |
| 75.3346969133507 | 6.807 | -7.742 | 240.779 | 241.018 |
| 75.50204537002605 | 6.728 | -7.963 | 236.408 | 236.657 |
| 75.66939382670138 | 6.642 | -8.196 | 231.918 | 232.175 |
| 75.83674228337672 | 6.524 | -8.381 | 226.846 | 227.11 |
| 76.00409074005208 | 6.382 | -8.539 | 221.447 | 221.72 |
| 76.17143919672742 | 6.23 | -8.691 | 215.982 | 216.264 |
| 76.33878765340276 | 6.09 | -8.838 | 210.418 | 210.707 |
| 76.49683897359614 | 5.95 | -8.979 | 204.646 | 204.944 |
| 76.66418743027148 | 5.796 | -9.077 | 198.734 | 199.039 |
| 76.83153588694682 | 5.645 | -9.145 | 192.722 | 193.036 |
| 76.99888434362218 | 5.521 | -9.188 | 186.801 | 187.122 |
| 77.16623280029752 | 5.391 | -9.224 | 180.806 | 181.135 |
| 77.33358125697285 | 5.225 | -9.246 | 174.964 | 175.299 |
| 77.5009297136482 | 5.062 | -9.263 | 169.027 | 169.37 |
| 77.66827817032356 | 4.883 | -9.291 | 163.077 | 163.427 |
| 77.83562662699889 | 4.711 | -9.312 | 157.32 | 157.679 |
| 78.00297508367423 | 4.552 | -9.342 | 151.667 | 152.036 |
| 78.17032354034959 | 4.413 | -9.347 | 146.106 | 146.484 |
| 78.33767199702493 | 4.283 | -9.305 | 140.835 | 141.221 |
| 78.50502045370027 | 4.134 | -9.242 | 135.64 | 136.031 |
| 78.67236891037561 | 3.994 | -9.165 | 130.677 | 131.073 |
| 78.83042023056899 | 3.852 | -9.092 | 125.84 | 126.242 |
| 78.99776868724433 | 3.722 | -9.015 | 121.073 | 121.479 |
| 79.16511714391969 | 3.595 | -8.941 | 116.428 | 116.84 |
| 79.33246560059503 | 3.479 | -8.867 | 111.971 | 112.39 |
| 79.49981405727036 | 3.371 | -8.802 | 107.524 | 107.95 |
| 79.66716251394571 | 3.267 | -8.729 | 103.134 | 103.567 |
| 79.83451097062107 | 3.17 | -8.631 | 98.873 | 99.313 |
| 80.00185942729641 | 3.088 | -8.503 | 94.761 | 95.206 |
| 80.16920788397174 | 3.035 | -8.338 | 90.83 | 91.278 |
| 80.33655634064709 | 3.002 | -8.144 | 87.162 | 87.609 |
| 80.50390479732243 | 2.979 | -7.932 | 83.741 | 84.186 |
| 80.67125325399778 | 2.964 | -7.701 | 80.593 | 81.032 |
| 80.83860171067312 | 2.933 | -7.463 | 77.767 | 78.197 |
| 80.99665303086651 | 2.894 | -7.237 | 74.683 | 75.107 |
| 81.16400148754184 | 2.852 | -7.007 | 71.703 | 72.119 |
| 81.3313499442172 | 2.818 | -6.769 | 68.993 | 69.4 |
| 81.49869840089255 | 2.8 | -6.492 | 66.321 | 66.714 |
| 81.66604685756786 | 2.787 | -6.205 | 63.772 | 64.151 |
| 81.83339531424322 | 2.764 | -5.921 | 61.329 | 61.694 |
| 82.00074377091858 | 2.735 | -5.634 | 58.986 | 59.336 |
| 82.16809222759392 | 2.694 | -5.357 | 56.89 | 57.224 |
| 82.33544068426926 | 2.661 | -5.051 | 54.898 | 55.215 |
| 82.50278914094459 | 2.638 | -4.707 | 52.955 | 53.252 |
| 82.67013759761994 | 2.61 | -4.371 | 51.13 | 51.409 |
| 82.83748605429528 | 2.569 | -4.031 | 49.363 | 49.628 |
| 83.00483451097062 | 2.503 | -3.63 | 47.621 | 47.883 |
| 83.17218296764597 | 2.464 | -3.317 | 45.974 | 46.224 |
| 83.33023428783935 | 2.431 | -3.019 | 44.371 | 44.62 |
| 83.4975827445147 | 2.386 | -2.705 | 42.879 | 43.131 |
| 83.66493120119004 | 2.336 | -2.424 | 41.505 | 41.757 |
| 83.83227965786537 | 2.279 | -2.123 | 40.196 | 40.449 |
| 83.99962811454073 | 2.224 | -1.846 | 39.004 | 39.259 |
| 84.16697657121607 | 2.176 | -1.612 | 37.946 | 38.202 |
| 84.33432502789142 | 2.118 | -1.383 | 36.952 | 37.212 |
| 84.50167348456677 | 2.065 | -1.167 | 36.009 | 36.27 |
| 84.6690219412421 | 2.012 | -0.957 | 35.139 | 35.405 |
| 84.83637039791745 | 1.966 | -0.74 | 34.261 | 34.531 |
| 85.0037188545928 | 1.924 | -0.525 | 33.414 | 33.693 |
| 85.17106731126813 | 1.882 | -0.32 | 32.638 | 32.918 |
| 85.33841576794349 | 1.849 | -0.114 | 31.866 | 32.143 |
| 85.50576422461883 | 1.812 | 0.079 | 31.17 | 31.445 |
| 85.66381554481221 | 1.778 | 0.256 | 30.563 | 30.836 |
| 85.83116400148755 | 1.762 | 0.461 | 29.867 | 30.138 |
| 85.99851245816289 | 1.746 | 0.676 | 29.195 | 29.464 |
| 86.16586091483823 | 1.732 | 0.902 | 28.562 | 28.831 |
| 86.33320937151358 | 1.728 | 1.146 | 27.911 | 28.179 |
| 86.50055782818893 | 1.706 | 1.328 | 27.365 | 27.636 |
| 86.66790628486427 | 1.679 | 1.464 | 26.858 | 27.13 |
| 86.83525474153961 | 1.66 | 1.624 | 26.371 | 26.644 |
| 87.00260319821496 | 1.646 | 1.852 | 25.919 | 26.204 |
| 87.16995165489031 | 1.635 | 2.093 | 25.502 | 25.803 |
| 87.33730011156564 | 1.622 | 2.351 | 25.103 | 25.421 |
| 87.504648568241 | 1.607 | 2.609 | 24.743 | 25.084 |
| 87.67199702491634 | 1.593 | 2.844 | 24.466 | 24.83 |
| 87.83004834510972 | 1.574 | 3.115 | 24.18 | 24.57 |
| 87.99739680178506 | 1.564 | 3.393 | 23.929 | 24.345 |
| 88.1647452584604 | 1.555 | 3.671 | 23.706 | 24.147 |
| 88.33209371513574 | 1.544 | 3.943 | 23.519 | 23.991 |
| 88.49944217181108 | 1.546 | 4.168 | 23.439 | 23.944 |
| 88.66679062848644 | 1.558 | 4.35 | 23.354 | 23.887 |
| 88.83413908516178 | 1.574 | 4.532 | 23.273 | 23.836 |
| 89.00148754183712 | 1.606 | 4.72 | 23.214 | 23.817 |
| 89.16883599851246 | 1.637 | 4.901 | 23.12 | 23.763 |
| 89.33618445518782 | 1.636 | 5.111 | 23.033 | 23.72 |
| 89.50353291186315 | 1.621 | 5.376 | 22.967 | 23.699 |
| 89.6708813685385 | 1.577 | 5.515 | 22.859 | 23.616 |
| 89.83822982521386 | 1.544 | 5.746 | 22.826 | 23.625 |
| 90.00557828188919 | 1.54 | 5.95 | 22.862 | 23.705 |
| 90.16362960208257 | 1.584 | 6.048 | 22.865 | 23.74 |
| 90.3309780587579 | 1.6 | 6.065 | 22.617 | 23.506 |
| 90.49832651543326 | 1.583 | 6.12 | 22.31 | 23.219 |
| 90.66567497210859 | 1.555 | 6.102 | 21.935 | 22.844 |
| 90.83302342878395 | 1.513 | 6.068 | 21.61 | 22.517 |
| 91.00037188545929 | 1.464 | 6.081 | 21.32 | 22.239 |
| 91.16772034213463 | 1.395 | 6.011 | 21.134 | 22.036 |
| 91.33506879880998 | 1.342 | 5.929 | 20.955 | 21.839 |
| 91.50241725548533 | 1.27 | 5.792 | 20.764 | 21.612 |
| 91.66976571216065 | 1.191 | 5.63 | 20.587 | 21.391 |
| 91.83711416883601 | 1.114 | 5.476 | 20.425 | 21.189 |
| 92.00446262551137 | 1.044 | 5.423 | 20.283 | 21.035 |
| 92.1718110821867 | 0.974 | 5.334 | 20.05 | 20.781 |
| 92.33915953886203 | 0.898 | 5.196 | 19.723 | 20.427 |
| 92.49721085905541 | 0.816 | 5.027 | 19.322 | 19.993 |
| 92.66455931573077 | 0.731 | 4.847 | 18.993 | 19.628 |
| 92.83190777240611 | 0.654 | 4.652 | 18.834 | 19.429 |
| 92.99925622908145 | 0.589 | 4.491 | 18.709 | 19.272 |
| 93.1666046857568 | 0.54 | 4.364 | 18.604 | 19.142 |
| 93.33395314243214 | 0.513 | 4.273 | 18.501 | 19.02 |
| 93.50130159910749 | 0.475 | 4.197 | 18.376 | 18.879 |
| 93.66865005578283 | 0.433 | 4.123 | 18.242 | 18.731 |
| 93.83599851245818 | 0.39 | 4.05 | 18.108 | 18.582 |
| 94.00334696913353 | 0.383 | 4.076 | 17.833 | 18.319 |
| 94.17069542580886 | 0.383 | 4.048 | 17.401 | 17.893 |
| 94.3380438824842 | 0.369 | 3.968 | 16.909 | 17.395 |
| 94.50539233915954 | 0.346 | 3.876 | 16.671 | 17.142 |
| 94.66344365935292 | 0.336 | 3.841 | 16.545 | 17.011 |
| 94.83079211602828 | 0.332 | 3.847 | 16.493 | 16.961 |
| 94.99814057270362 | 0.329 | 3.859 | 16.364 | 16.836 |
| 95.16548902937897 | 0.338 | 3.866 | 16.291 | 16.766 |
| 95.33283748605432 | 0.337 | 3.864 | 16.22 | 16.699 |
| 95.50018594272963 | 0.344 | 3.885 | 16.15 | 16.636 |
| 95.66753439940499 | 0.362 | 3.909 | 16.096 | 16.592 |
| 95.83488285608034 | 0.354 | 3.906 | 15.936 | 16.436 |
| 96.00223131275567 | 0.35 | 3.897 | 15.887 | 16.385 |
| 96.16957976943102 | 0.34 | 3.844 | 15.731 | 16.22 |
| 96.33692822610638 | 0.337 | 3.766 | 15.679 | 16.151 |
| 96.50427668278171 | 0.329 | 3.791 | 15.875 | 16.348 |
| 96.67162513945706 | 0.325 | 3.818 | 15.91 | 16.389 |
| 96.8389735961324 | 0.37 | 3.901 | 15.777 | 16.278 |
| 96.99702491632577 | 0.449 | 4.02 | 15.593 | 16.126 |
| 97.16437337300111 | 0.483 | 4.042 | 15.35 | 15.895 |
| 97.33172182967647 | 0.471 | 3.998 | 15.206 | 15.743 |
| 97.49907028635181 | 0.443 | 3.924 | 15.15 | 15.671 |
| 97.66641874302715 | 0.406 | 3.792 | 15.115 | 15.607 |
| 97.8337671997025 | 0.35 | 3.663 | 15.307 | 15.764 |
| 98.00111565637785 | 0.294 | 3.579 | 15.542 | 15.976 |
| 98.16846411305319 | 0.261 | 3.519 | 15.808 | 16.226 |
| 98.33581256972855 | 0.237 | 3.491 | 16.021 | 16.429 |
| 98.50316102640389 | 0.211 | 3.503 | 16.255 | 16.66 |
| 98.67050948307921 | 0.186 | 3.492 | 16.31 | 16.709 |
| 98.83785793975456 | 0.181 | 3.492 | 16.384 | 16.779 |
| 99.0052063964299 | 0.179 | 3.493 | 16.461 | 16.853 |
| 99.17255485310525 | 0.177 | 3.497 | 16.495 | 16.889 |
| 99.33060617329863 | 0.171 | 3.479 | 16.396 | 16.79 |
| 99.49795462997399 | 0.162 | 3.418 | 16.186 | 16.575 |
| 99.66530308664933 | 0.146 | 3.352 | 16.035 | 16.419 |
| 99.83265154332467 | 0.103 | 3.279 | 16.136 | 16.516 |
| 100.0 | 0.061 | 3.204 | 16.237 | 16.612 |